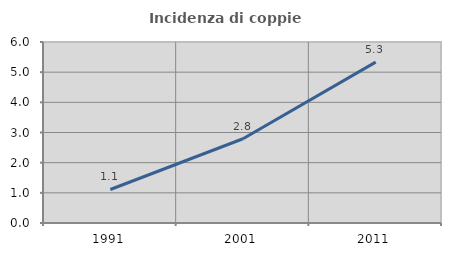
| Category | Incidenza di coppie miste |
|---|---|
| 1991.0 | 1.111 |
| 2001.0 | 2.793 |
| 2011.0 | 5.333 |